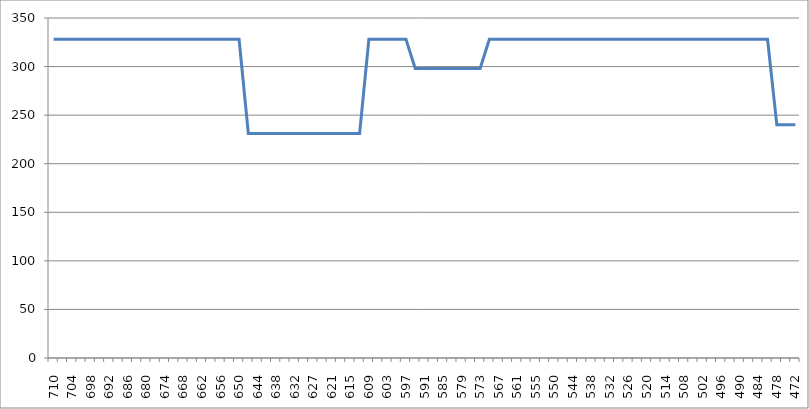
| Category | Series 0 |
|---|---|
| 710.0 | 328 |
| 707.0 | 328 |
| 704.0 | 328 |
| 701.0 | 328 |
| 698.0 | 328 |
| 695.0 | 328 |
| 692.0 | 328 |
| 689.0 | 328 |
| 686.0 | 328 |
| 683.0 | 328 |
| 680.0 | 328 |
| 677.0 | 328 |
| 674.0 | 328 |
| 671.0 | 328 |
| 668.0 | 328 |
| 665.0 | 328 |
| 662.0 | 328 |
| 659.0 | 328 |
| 656.0 | 328 |
| 653.0 | 328 |
| 650.0 | 328 |
| 647.0 | 231 |
| 644.0 | 231 |
| 641.0 | 231 |
| 638.0 | 231 |
| 635.0 | 231 |
| 632.0 | 231 |
| 630.0 | 231 |
| 627.0 | 231 |
| 624.0 | 231 |
| 621.0 | 231 |
| 618.0 | 231 |
| 615.0 | 231 |
| 612.0 | 231 |
| 609.0 | 328 |
| 606.0 | 328 |
| 603.0 | 328 |
| 600.0 | 328 |
| 597.0 | 328 |
| 594.0 | 298 |
| 591.0 | 298 |
| 588.0 | 298 |
| 585.0 | 298 |
| 582.0 | 298 |
| 579.0 | 298 |
| 576.0 | 298 |
| 573.0 | 298 |
| 570.0 | 328 |
| 567.0 | 328 |
| 564.0 | 328 |
| 561.0 | 328 |
| 558.0 | 328 |
| 555.0 | 328 |
| 552.0 | 328 |
| 550.0 | 328 |
| 547.0 | 328 |
| 544.0 | 328 |
| 541.0 | 328 |
| 538.0 | 328 |
| 535.0 | 328 |
| 532.0 | 328 |
| 529.0 | 328 |
| 526.0 | 328 |
| 523.0 | 328 |
| 520.0 | 328 |
| 517.0 | 328 |
| 514.0 | 328 |
| 511.0 | 328 |
| 508.0 | 328 |
| 505.0 | 328 |
| 502.0 | 328 |
| 499.0 | 328 |
| 496.0 | 328 |
| 493.0 | 328 |
| 490.0 | 328 |
| 487.0 | 328 |
| 484.0 | 328 |
| 481.0 | 328 |
| 478.0 | 240 |
| 475.0 | 240 |
| 472.0 | 240 |